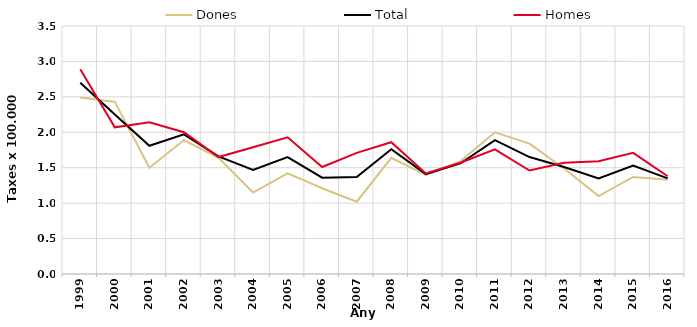
| Category | Dones | Total | Homes |
|---|---|---|---|
| 1999.0 | 2.49 | 2.7 | 2.89 |
| 2000.0 | 2.43 | 2.25 | 2.07 |
| 2001.0 | 1.5 | 1.81 | 2.14 |
| 2002.0 | 1.89 | 1.97 | 2 |
| 2003.0 | 1.64 | 1.66 | 1.65 |
| 2004.0 | 1.15 | 1.47 | 1.79 |
| 2005.0 | 1.42 | 1.65 | 1.93 |
| 2006.0 | 1.21 | 1.36 | 1.51 |
| 2007.0 | 1.02 | 1.37 | 1.71 |
| 2008.0 | 1.64 | 1.76 | 1.86 |
| 2009.0 | 1.4 | 1.41 | 1.42 |
| 2010.0 | 1.59 | 1.56 | 1.57 |
| 2011.0 | 2 | 1.89 | 1.76 |
| 2012.0 | 1.84 | 1.65 | 1.46 |
| 2013.0 | 1.49 | 1.51 | 1.57 |
| 2014.0 | 1.1 | 1.35 | 1.59 |
| 2015.0 | 1.37 | 1.53 | 1.71 |
| 2016.0 | 1.33 | 1.35 | 1.38 |